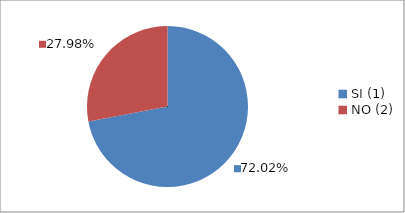
| Category | Series 0 |
|---|---|
| SI (1) | 0.72 |
| NO (2) | 0.28 |